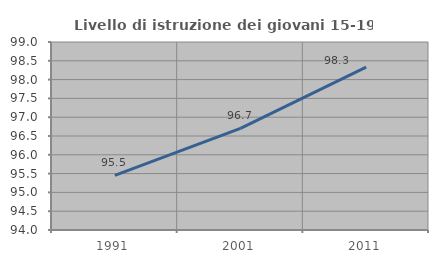
| Category | Livello di istruzione dei giovani 15-19 anni |
|---|---|
| 1991.0 | 95.455 |
| 2001.0 | 96.703 |
| 2011.0 | 98.333 |